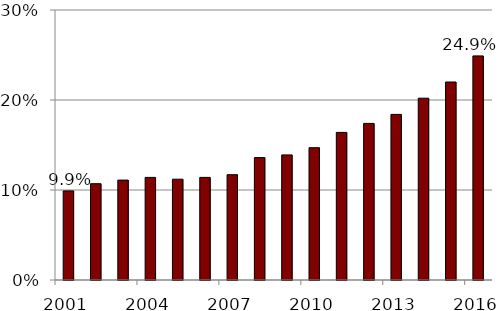
| Category | Series 0 |
|---|---|
| 2001.0 | 0.099 |
| 2002.0 | 0.107 |
| 2003.0 | 0.111 |
| 2004.0 | 0.114 |
| 2005.0 | 0.112 |
| 2006.0 | 0.114 |
| 2007.0 | 0.117 |
| 2008.0 | 0.136 |
| 2009.0 | 0.139 |
| 2010.0 | 0.147 |
| 2011.0 | 0.164 |
| 2012.0 | 0.174 |
| 2013.0 | 0.184 |
| 2014.0 | 0.202 |
| 2015.0 | 0.22 |
| 2016.0 | 0.249 |